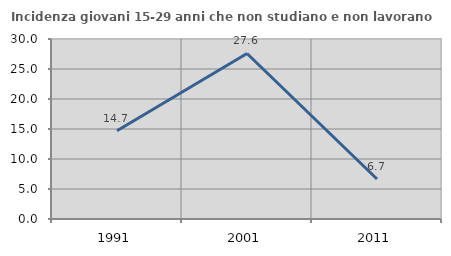
| Category | Incidenza giovani 15-29 anni che non studiano e non lavorano  |
|---|---|
| 1991.0 | 14.715 |
| 2001.0 | 27.586 |
| 2011.0 | 6.667 |